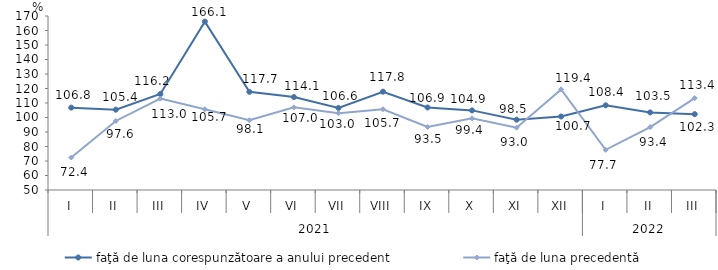
| Category | faţă de luna corespunzătoare a anului precedent | faţă de luna precedentă   |
|---|---|---|
| 0 | 106.8 | 72.4 |
| 1 | 105.4 | 97.6 |
| 2 | 116.2 | 113 |
| 3 | 166.1 | 105.7 |
| 4 | 117.7 | 98.1 |
| 5 | 114.1 | 107 |
| 6 | 106.6 | 103 |
| 7 | 117.8 | 105.7 |
| 8 | 106.9 | 93.5 |
| 9 | 104.9 | 99.4 |
| 10 | 98.5 | 93 |
| 11 | 100.7 | 119.4 |
| 12 | 108.4 | 77.7 |
| 13 | 103.5 | 93.4 |
| 14 | 102.3 | 113.4 |